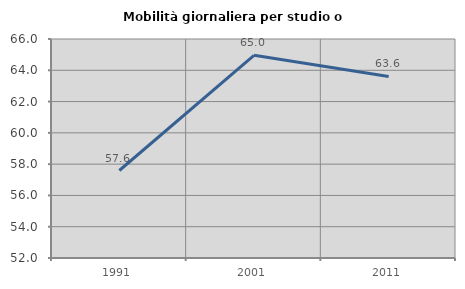
| Category | Mobilità giornaliera per studio o lavoro |
|---|---|
| 1991.0 | 57.593 |
| 2001.0 | 64.957 |
| 2011.0 | 63.609 |